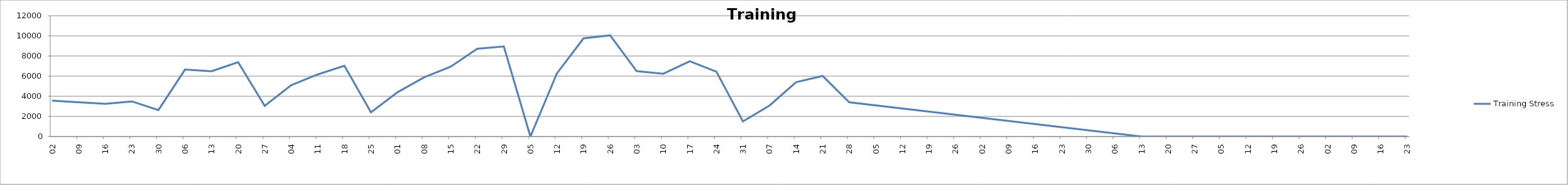
| Category | Training Stress |
|---|---|
| 2011-05-02 | 3562 |
| 2011-05-09 | 0 |
| 2011-05-16 | 3250 |
| 2011-05-23 | 3490 |
| 2011-05-30 | 2630 |
| 2011-06-06 | 6652 |
| 2011-06-13 | 6488 |
| 2011-06-20 | 7388 |
| 2011-06-27 | 3052 |
| 2011-07-04 | 5098 |
| 2011-07-11 | 6174 |
| 2011-07-18 | 7034 |
| 2011-07-25 | 2410 |
| 2011-08-01 | 4400 |
| 2011-08-08 | 5884 |
| 2011-08-15 | 6944 |
| 2011-08-22 | 8720 |
| 2011-08-29 | 8948 |
| 2011-09-05 | 0 |
| 2011-09-12 | 6286 |
| 2011-09-19 | 9750 |
| 2011-09-26 | 10054 |
| 2011-10-03 | 6494 |
| 2011-10-10 | 6242 |
| 2011-10-17 | 7476 |
| 2011-10-24 | 6448 |
| 2011-10-31 | 1500 |
| 2011-11-07 | 3082 |
| 2011-11-14 | 5398 |
| 2011-11-21 | 6018 |
| 2011-11-28 | 3408 |
| 2011-12-05 | 0 |
| 2011-12-12 | 0 |
| 2011-12-19 | 0 |
| 2011-12-26 | 0 |
| 2012-01-02 | 0 |
| 2012-01-09 | 0 |
| 2012-01-16 | 0 |
| 2012-01-23 | 0 |
| 2012-01-30 | 0 |
| 2012-02-06 | 0 |
| 2012-02-13 | 0 |
| 2012-02-20 | 0 |
| 2012-02-27 | 0 |
| 2012-03-05 | 0 |
| 2012-03-12 | 0 |
| 2012-03-19 | 0 |
| 2012-03-26 | 0 |
| 2012-04-02 | 0 |
| 2012-04-09 | 0 |
| 2012-04-16 | 0 |
| 2012-04-23 | 0 |